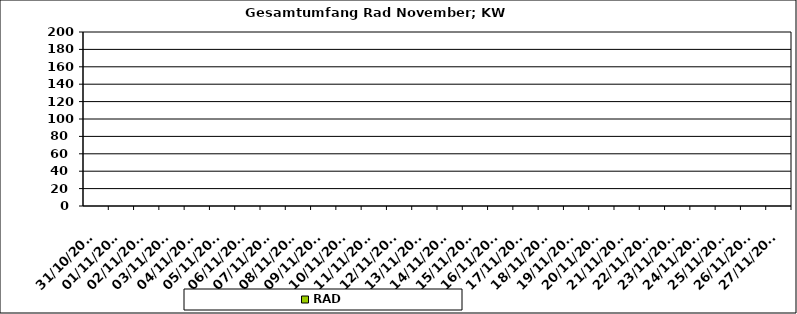
| Category | RAD |
|---|---|
| 31/10/2022 | 0 |
| 01/11/2022 | 0 |
| 02/11/2022 | 0 |
| 03/11/2022 | 0 |
| 04/11/2022 | 0 |
| 05/11/2022 | 0 |
| 06/11/2022 | 0 |
| 07/11/2022 | 0 |
| 08/11/2022 | 0 |
| 09/11/2022 | 0 |
| 10/11/2022 | 0 |
| 11/11/2022 | 0 |
| 12/11/2022 | 0 |
| 13/11/2022 | 0 |
| 14/11/2022 | 0 |
| 15/11/2022 | 0 |
| 16/11/2022 | 0 |
| 17/11/2022 | 0 |
| 18/11/2022 | 0 |
| 19/11/2022 | 0 |
| 20/11/2022 | 0 |
| 21/11/2022 | 0 |
| 22/11/2022 | 0 |
| 23/11/2022 | 0 |
| 24/11/2022 | 0 |
| 25/11/2022 | 0 |
| 26/11/2022 | 0 |
| 27/11/2022 | 0 |